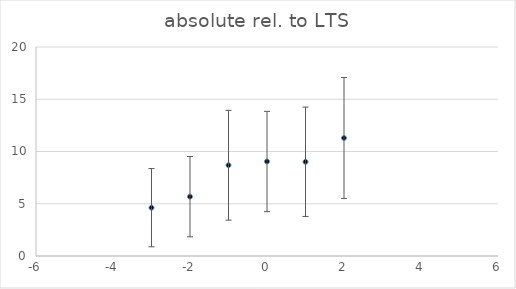
| Category | Series 0 |
|---|---|
| -3.0 | 4.625 |
| -2.0 | 5.678 |
| -1.0 | 8.684 |
| 0.0 | 9.044 |
| 1.0 | 9.015 |
| 2.0 | 11.292 |